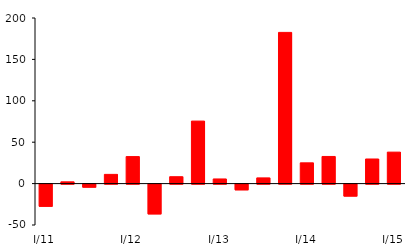
| Category | Series 1 |
|---|---|
| I/11 | -26.789 |
| II | 2.123 |
| III | -3.698 |
| IV | 11.134 |
| I/12 | 32.632 |
| II | -35.982 |
| III | 8.321 |
| IV | 75.502 |
| I/13 | 5.61 |
| II | -6.912 |
| III | 6.889 |
| IV | 182.604 |
| I/14 | 25.08 |
| II | 32.776 |
| III | -14.448 |
| IV | 29.714 |
| I/15 | 38.01 |